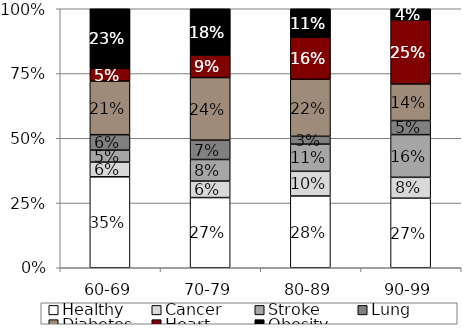
| Category | Healthy | Cancer | Stroke | Lung | Diabetes | Heart | Obesity |
|---|---|---|---|---|---|---|---|
| 60-69 | 0.351 | 0.057 | 0.046 | 0.06 | 0.207 | 0.049 | 0.231 |
| 70-79 | 0.271 | 0.064 | 0.083 | 0.075 | 0.241 | 0.087 | 0.179 |
| 80-89 | 0.277 | 0.095 | 0.105 | 0.03 | 0.22 | 0.162 | 0.11 |
| 90-99 | 0.269 | 0.081 | 0.165 | 0.054 | 0.141 | 0.247 | 0.043 |